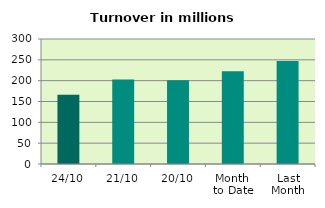
| Category | Series 0 |
|---|---|
| 24/10 | 165.938 |
| 21/10 | 202.996 |
| 20/10 | 200.816 |
| Month 
to Date | 222.422 |
| Last
Month | 247.353 |